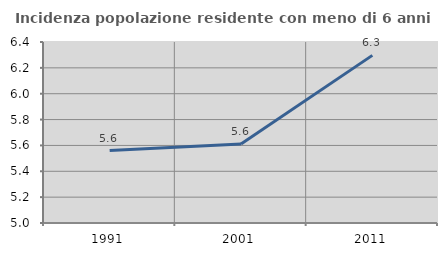
| Category | Incidenza popolazione residente con meno di 6 anni |
|---|---|
| 1991.0 | 5.56 |
| 2001.0 | 5.611 |
| 2011.0 | 6.297 |